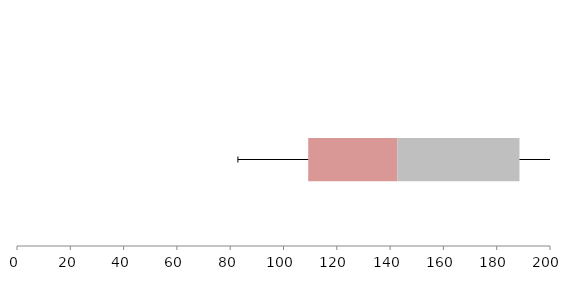
| Category | Series 1 | Series 2 | Series 3 |
|---|---|---|---|
| 0 | 109.273 | 33.507 | 45.766 |